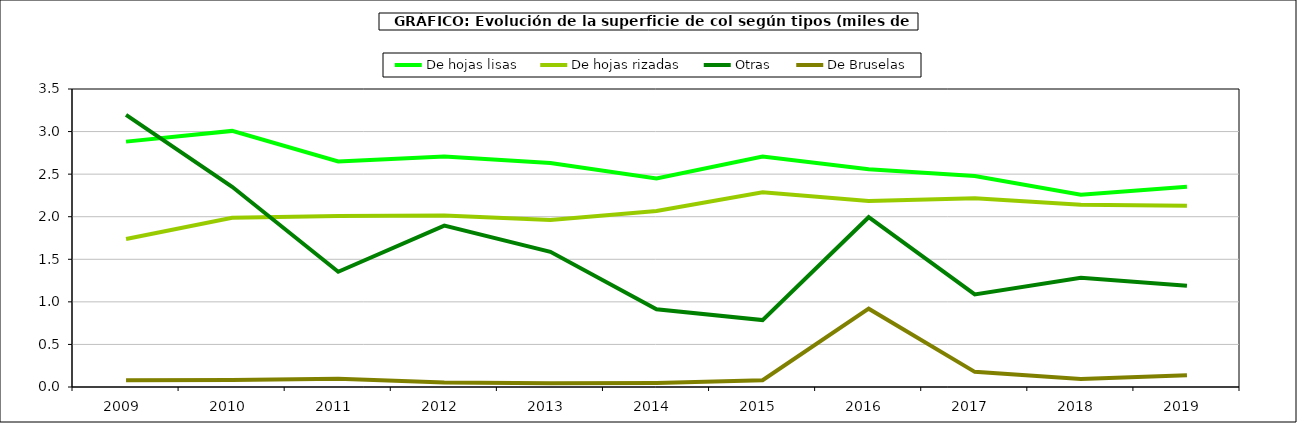
| Category | De hojas lisas | De hojas rizadas | Otras | De Bruselas |
|---|---|---|---|---|
| 2009.0 | 2.882 | 1.738 | 3.197 | 0.078 |
| 2010.0 | 3.008 | 1.987 | 2.352 | 0.083 |
| 2011.0 | 2.648 | 2.008 | 1.354 | 0.098 |
| 2012.0 | 2.707 | 2.014 | 1.895 | 0.053 |
| 2013.0 | 2.631 | 1.962 | 1.588 | 0.043 |
| 2014.0 | 2.45 | 2.067 | 0.914 | 0.048 |
| 2015.0 | 2.707 | 2.288 | 0.786 | 0.08 |
| 2016.0 | 2.557 | 2.186 | 1.994 | 0.92 |
| 2017.0 | 2.479 | 2.218 | 1.087 | 0.178 |
| 2018.0 | 2.257 | 2.141 | 1.282 | 0.094 |
| 2019.0 | 2.351 | 2.128 | 1.188 | 0.139 |